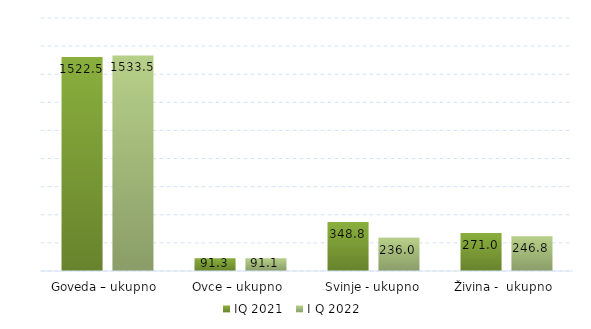
| Category | IQ 2021 | I Q 2022 |
|---|---|---|
| Goveda – ukupno  | 1522.5 | 1533.5 |
| Ovce – ukupno  | 91.3 | 91.1 |
| Svinje - ukupno | 348.8 | 236 |
| Živina -  ukupno  | 271 | 246.8 |